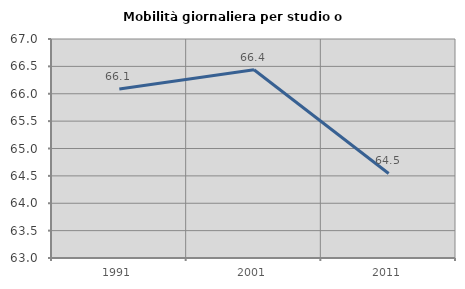
| Category | Mobilità giornaliera per studio o lavoro |
|---|---|
| 1991.0 | 66.087 |
| 2001.0 | 66.439 |
| 2011.0 | 64.543 |